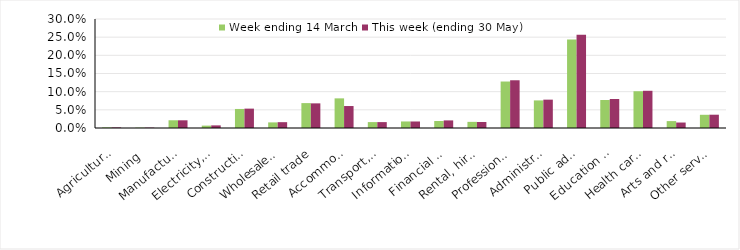
| Category | Week ending 14 March | This week (ending 30 May) |
|---|---|---|
| Agriculture, forestry and fishing | 0.002 | 0.002 |
| Mining | 0.001 | 0.001 |
| Manufacturing | 0.021 | 0.021 |
| Electricity, gas, water and waste services | 0.007 | 0.007 |
| Construction | 0.052 | 0.053 |
| Wholesale trade | 0.015 | 0.016 |
| Retail trade | 0.069 | 0.068 |
| Accommodation and food services | 0.082 | 0.06 |
| Transport, postal and warehousing | 0.016 | 0.016 |
| Information media and telecommunications | 0.018 | 0.018 |
| Financial and insurance services | 0.019 | 0.021 |
| Rental, hiring and real estate services | 0.017 | 0.017 |
| Professional, scientific and technical services | 0.128 | 0.131 |
| Administrative and support services | 0.076 | 0.078 |
| Public administration and safety | 0.244 | 0.256 |
| Education and training | 0.077 | 0.08 |
| Health care and social assistance | 0.101 | 0.102 |
| Arts and recreation services | 0.019 | 0.015 |
| Other services | 0.036 | 0.037 |